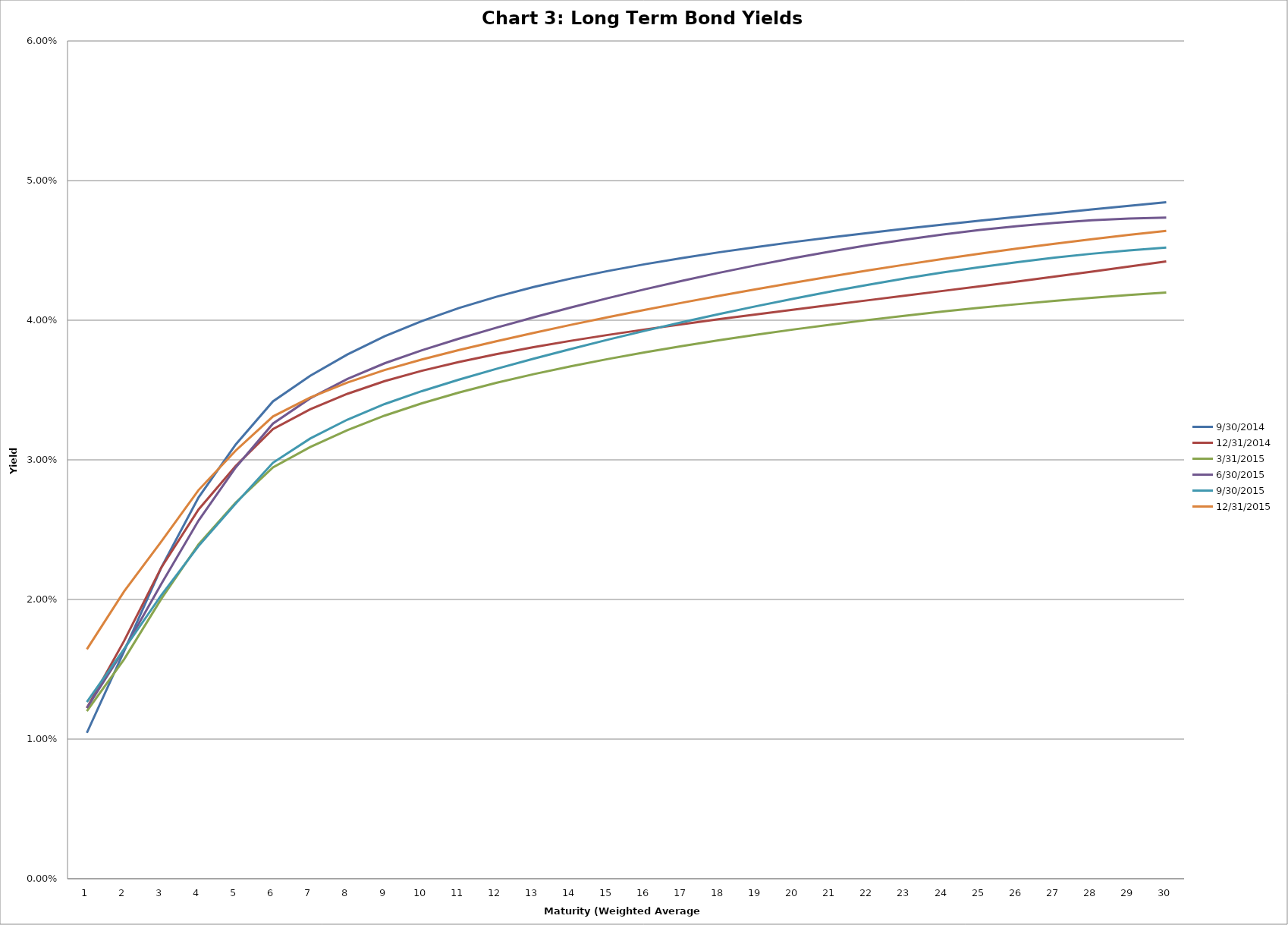
| Category | 9/30/2014 | 12/31/2014 | 3/31/2015 | 6/30/2015 | 9/30/2015 | 12/31/2015 |
|---|---|---|---|---|---|---|
| 0 | 0.01 | 0.012 | 0.012 | 0.012 | 0.013 | 0.016 |
| 1 | 0.016 | 0.017 | 0.016 | 0.016 | 0.016 | 0.021 |
| 2 | 0.022 | 0.022 | 0.02 | 0.021 | 0.02 | 0.024 |
| 3 | 0.027 | 0.026 | 0.024 | 0.026 | 0.024 | 0.028 |
| 4 | 0.031 | 0.03 | 0.027 | 0.029 | 0.027 | 0.031 |
| 5 | 0.034 | 0.032 | 0.029 | 0.033 | 0.03 | 0.033 |
| 6 | 0.036 | 0.034 | 0.031 | 0.034 | 0.032 | 0.034 |
| 7 | 0.038 | 0.035 | 0.032 | 0.036 | 0.033 | 0.036 |
| 8 | 0.039 | 0.036 | 0.033 | 0.037 | 0.034 | 0.036 |
| 9 | 0.04 | 0.036 | 0.034 | 0.038 | 0.035 | 0.037 |
| 10 | 0.041 | 0.037 | 0.035 | 0.039 | 0.036 | 0.038 |
| 11 | 0.042 | 0.038 | 0.036 | 0.039 | 0.037 | 0.038 |
| 12 | 0.042 | 0.038 | 0.036 | 0.04 | 0.037 | 0.039 |
| 13 | 0.043 | 0.039 | 0.037 | 0.041 | 0.038 | 0.04 |
| 14 | 0.044 | 0.039 | 0.037 | 0.042 | 0.039 | 0.04 |
| 15 | 0.044 | 0.039 | 0.038 | 0.042 | 0.039 | 0.041 |
| 16 | 0.044 | 0.04 | 0.038 | 0.043 | 0.04 | 0.041 |
| 17 | 0.045 | 0.04 | 0.039 | 0.043 | 0.04 | 0.042 |
| 18 | 0.045 | 0.04 | 0.039 | 0.044 | 0.041 | 0.042 |
| 19 | 0.046 | 0.041 | 0.039 | 0.044 | 0.042 | 0.043 |
| 20 | 0.046 | 0.041 | 0.04 | 0.045 | 0.042 | 0.043 |
| 21 | 0.046 | 0.041 | 0.04 | 0.045 | 0.043 | 0.044 |
| 22 | 0.047 | 0.042 | 0.04 | 0.046 | 0.043 | 0.044 |
| 23 | 0.047 | 0.042 | 0.041 | 0.046 | 0.043 | 0.044 |
| 24 | 0.047 | 0.042 | 0.041 | 0.046 | 0.044 | 0.045 |
| 25 | 0.047 | 0.043 | 0.041 | 0.047 | 0.044 | 0.045 |
| 26 | 0.048 | 0.043 | 0.041 | 0.047 | 0.044 | 0.045 |
| 27 | 0.048 | 0.043 | 0.042 | 0.047 | 0.045 | 0.046 |
| 28 | 0.048 | 0.044 | 0.042 | 0.047 | 0.045 | 0.046 |
| 29 | 0.048 | 0.044 | 0.042 | 0.047 | 0.045 | 0.046 |